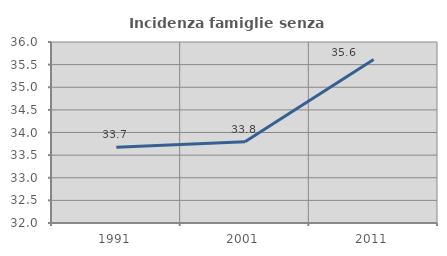
| Category | Incidenza famiglie senza nuclei |
|---|---|
| 1991.0 | 33.673 |
| 2001.0 | 33.798 |
| 2011.0 | 35.614 |